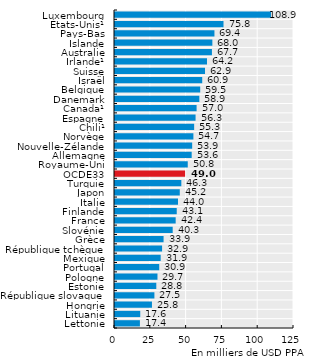
| Category | Series 0 |
|---|---|
| Lettonie | 17.397 |
| Lituanie | 17.627 |
| Hongrie | 25.803 |
| République slovaque | 27.514 |
| Estonie | 28.839 |
| Pologne | 29.661 |
| Portugal | 30.888 |
| Mexique | 31.894 |
| République tchèque | 32.879 |
| Grèce | 33.92 |
| Slovénie | 40.288 |
| France | 42.367 |
| Finlande | 43.116 |
| Italie | 43.992 |
| Japon | 45.236 |
| Turquie | 46.32 |
| OCDE33 | 48.954 |
| Royaume-Uni | 50.803 |
| Allemagne | 53.551 |
| Nouvelle-Zélande | 53.89 |
| Norvège | 54.743 |
| Chili¹ | 55.272 |
| Espagne | 56.263 |
| Canada¹ | 56.979 |
| Danemark | 58.891 |
| Belgique | 59.503 |
| Israël | 60.914 |
| Suisse | 62.857 |
| Irlande¹ | 64.242 |
| Australie | 67.688 |
| Islande | 67.985 |
| Pays-Bas | 69.445 |
| États-Unis¹ | 75.77 |
| Luxembourg | 108.928 |